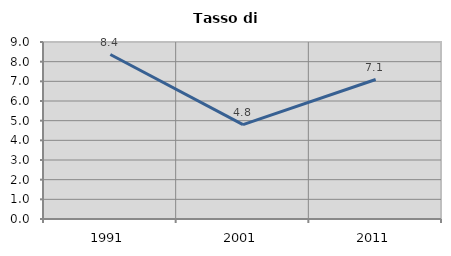
| Category | Tasso di disoccupazione   |
|---|---|
| 1991.0 | 8.363 |
| 2001.0 | 4.8 |
| 2011.0 | 7.093 |